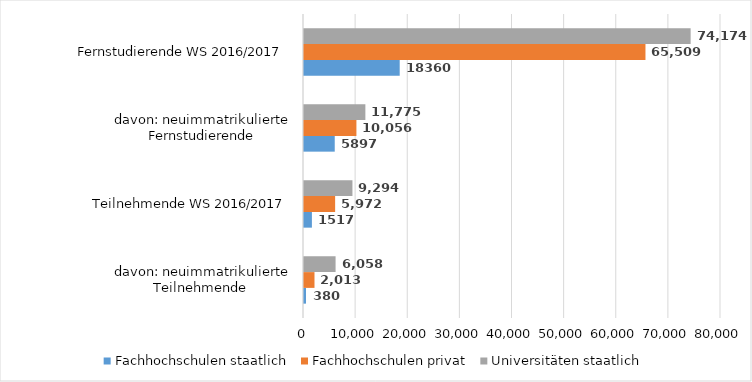
| Category | Fachhochschulen | Universitäten |
|---|---|---|
| davon: neuimmatrikulierte Teilnehmende  | 2013 | 6058 |
| Teilnehmende WS 2016/2017 | 5972 | 9294 |
| davon: neuimmatrikulierte Fernstudierende | 10056 | 11775 |
| Fernstudierende WS 2016/2017 | 65509 | 74174 |